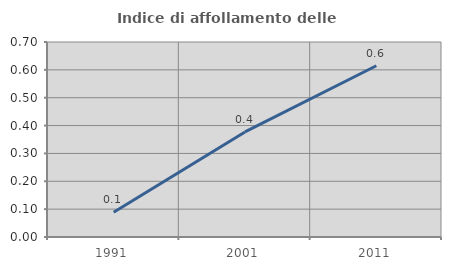
| Category | Indice di affollamento delle abitazioni  |
|---|---|
| 1991.0 | 0.089 |
| 2001.0 | 0.377 |
| 2011.0 | 0.615 |